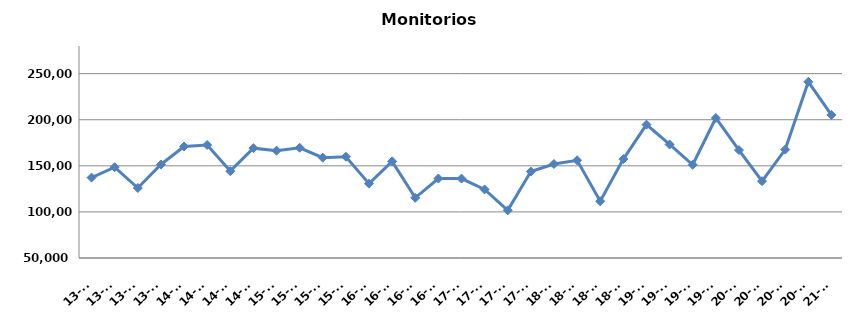
| Category | Monitorios ingresados |
|---|---|
| 13-T1 | 137260 |
| 13-T2 | 148525 |
| 13-T3 | 125943 |
| 13-T4 | 151448 |
| 14-T1 | 170973 |
| 14-T2 | 172648 |
| 14-T3 | 144262 |
| 14-T4 | 169174 |
| 15-T1 | 166433 |
| 15-T2 | 169612 |
| 15-T3 | 158859 |
| 15-T4 | 159890 |
| 16-T1 | 130680 |
| 16-T2 | 154860 |
| 16-T3 | 115269 |
| 16-T4 | 136245 |
| 17-T1 | 136155 |
| 17-T2 | 124382 |
| 17-T3 | 101751 |
| 17-T4 | 143788 |
| 18-T1 | 151974 |
| 18-T2 | 155991 |
| 18-T3 | 111544 |
| 18-T4 | 157337 |
| 19-T1 | 194715 |
| 19-T2 | 173225 |
| 19-T3 | 151156 |
| 19-T4 | 201895 |
| 20-T1 | 167095 |
| 20-T2 | 133351 |
| 20-T3 | 167630 |
| 20-T4 | 241119 |
| 21-T1 | 205212 |